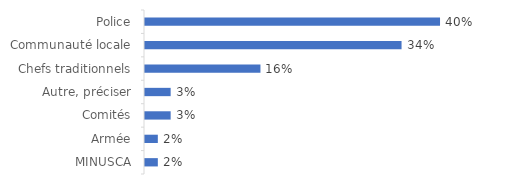
| Category | % |
|---|---|
| MINUSCA | 0.017 |
| Armée | 0.017 |
| Comités | 0.034 |
| Autre, préciser | 0.034 |
| Chefs traditionnels | 0.155 |
| Communauté locale | 0.345 |
| Police | 0.397 |